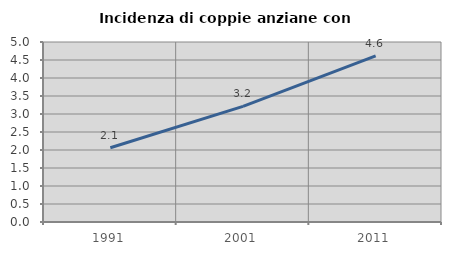
| Category | Incidenza di coppie anziane con figli |
|---|---|
| 1991.0 | 2.062 |
| 2001.0 | 3.212 |
| 2011.0 | 4.615 |